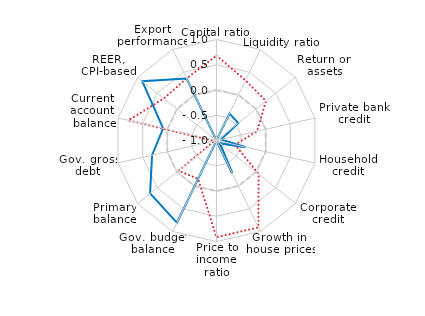
| Category | Long-term average | 2007 average | 2021Q1 (or latest data available) |
|---|---|---|---|
| Capital ratio | 0 | 0.681 | -1 |
| Liquidity ratio | 0 | 0.322 | -0.409 |
| Return on assets | 0 | 0.254 | -0.446 |
| Private bank
credit | 0 | -0.177 | -0.906 |
| Household
credit | 0 | -0.625 | -0.415 |
| Corporate
credit | 0 | 0.068 | -0.91 |
| Growth in 
house prices | 0 | 0.91 | -0.282 |
| Price to income
ratio | 0 | 0.914 | -1 |
| Gov. budget balance | 0 | -0.157 | 0.806 |
| Primary balance | 0 | -0.037 | 0.682 |
| Gov. gross debt | 0 | -0.952 | 0.308 |
| Current account
 balance | 0 | 0.791 | 0.084 |
| REER, CPI-based | 0 | 0.334 | 0.881 |
| Export performance | 0 | 0.364 | 0.364 |